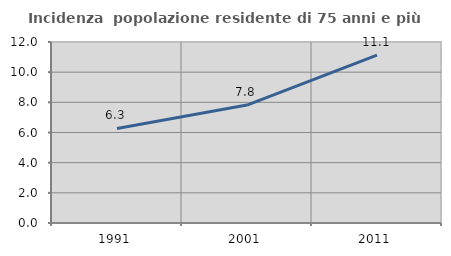
| Category | Incidenza  popolazione residente di 75 anni e più |
|---|---|
| 1991.0 | 6.269 |
| 2001.0 | 7.821 |
| 2011.0 | 11.135 |